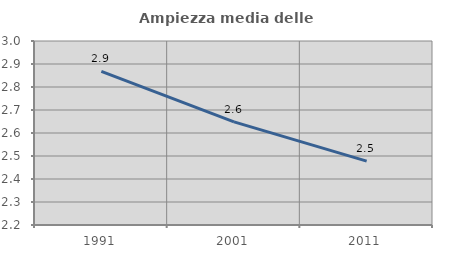
| Category | Ampiezza media delle famiglie |
|---|---|
| 1991.0 | 2.868 |
| 2001.0 | 2.648 |
| 2011.0 | 2.478 |